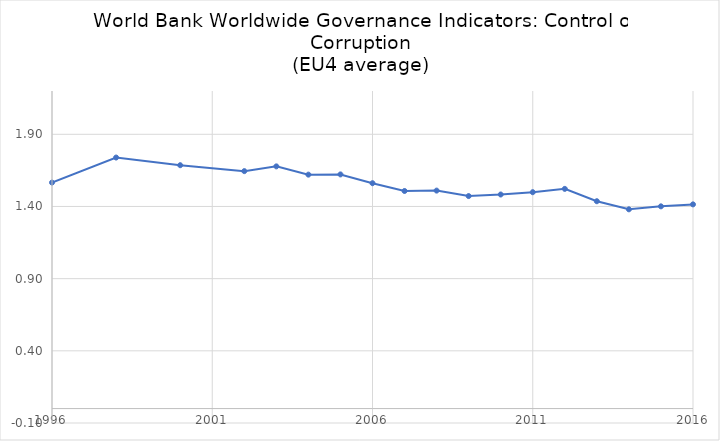
| Category | Avg |
|---|---|
| 1996.0 | 1.566 |
| 1998.0 | 1.739 |
| 2000.0 | 1.686 |
| 2002.0 | 1.645 |
| 2003.0 | 1.678 |
| 2004.0 | 1.621 |
| 2005.0 | 1.622 |
| 2006.0 | 1.561 |
| 2007.0 | 1.507 |
| 2008.0 | 1.51 |
| 2009.0 | 1.472 |
| 2010.0 | 1.483 |
| 2011.0 | 1.499 |
| 2012.0 | 1.522 |
| 2013.0 | 1.436 |
| 2014.0 | 1.38 |
| 2015.0 | 1.401 |
| 2016.0 | 1.415 |